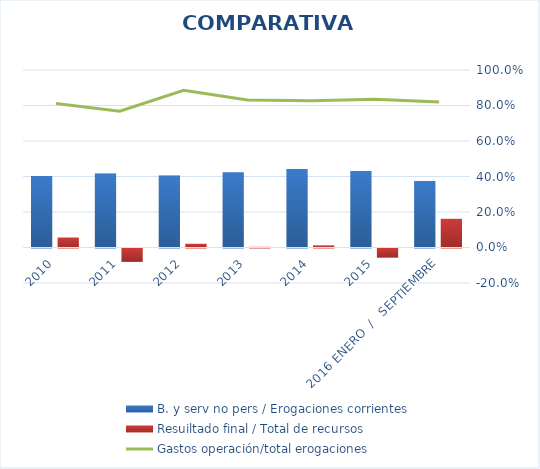
| Category | B. y serv no pers / Erogaciones corrientes | Resuiltado final / Total de recursos |
|---|---|---|
| 2010 | 0.403 | 0.056 |
| 2011 | 0.416 | -0.075 |
| 2012 | 0.405 | 0.021 |
| 2013 | 0.424 | 0.004 |
| 2014 | 0.442 | 0.012 |
| 2015 | 0.431 | -0.052 |
|  2016 ENERO  /   SEPTIEMBRE | 0.375 | 0.162 |